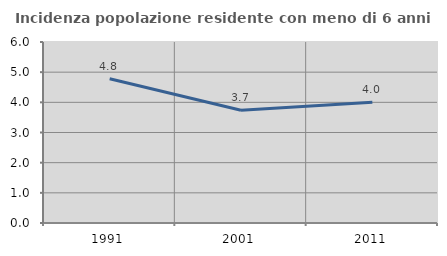
| Category | Incidenza popolazione residente con meno di 6 anni |
|---|---|
| 1991.0 | 4.784 |
| 2001.0 | 3.737 |
| 2011.0 | 4 |